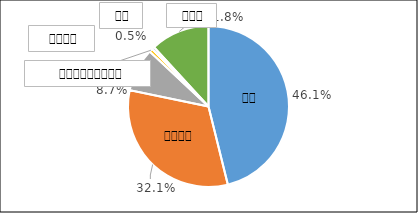
| Category | Series 0 |
|---|---|
| 0 | 0.461 |
| 1 | 0.321 |
| 2 | 0.087 |
| 3 | 0.007 |
| 4 | 0.005 |
| 5 | 0.118 |